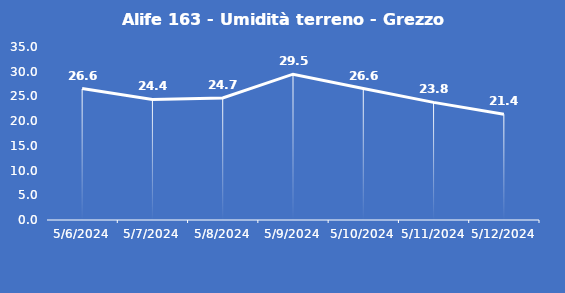
| Category | Alife 163 - Umidità terreno - Grezzo (%VWC) |
|---|---|
| 5/6/24 | 26.6 |
| 5/7/24 | 24.4 |
| 5/8/24 | 24.7 |
| 5/9/24 | 29.5 |
| 5/10/24 | 26.6 |
| 5/11/24 | 23.8 |
| 5/12/24 | 21.4 |